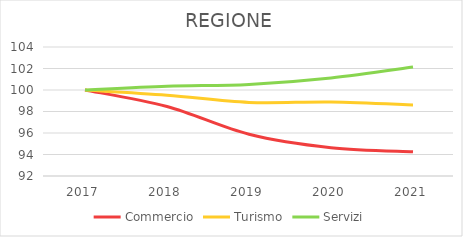
| Category | Commercio | Turismo | Servizi |
|---|---|---|---|
| 2017.0 | 100 | 100 | 100 |
| 2018.0 | 98.464 | 99.52 | 100.345 |
| 2019.0 | 95.882 | 98.845 | 100.522 |
| 2020.0 | 94.631 | 98.887 | 101.126 |
| 2021.0 | 94.251 | 98.614 | 102.137 |